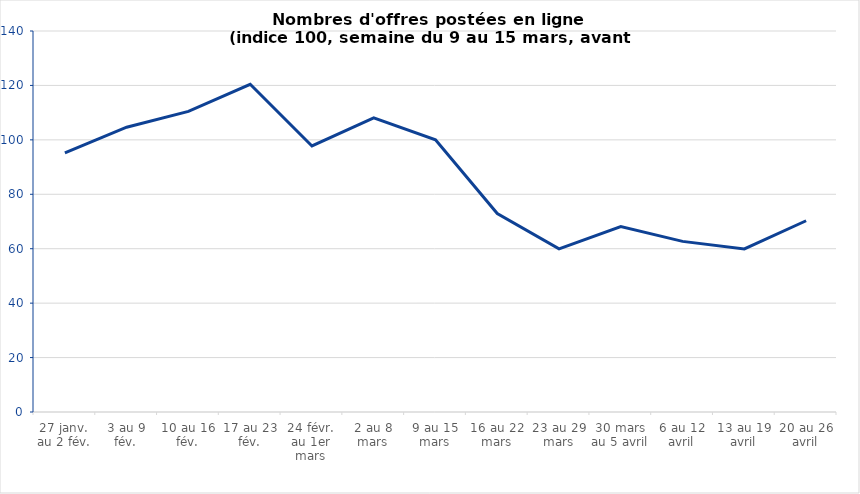
| Category | Series 0 |
|---|---|
| 27 janv. au 2 fév. | 95.185 |
| 3 au 9 fév. | 104.648 |
| 10 au 16 fév. | 110.442 |
| 17 au 23 fév. | 120.431 |
| 24 févr. au 1er mars | 97.757 |
| 2 au 8 mars | 108.052 |
| 9 au 15 mars | 100 |
| 16 au 22 mars | 72.925 |
| 23 au 29 mars | 59.965 |
| 30 mars au 5 avril | 68.123 |
| 6 au 12 avril | 62.691 |
| 13 au 19 avril | 59.916 |
| 20 au 26 avril | 70.272 |